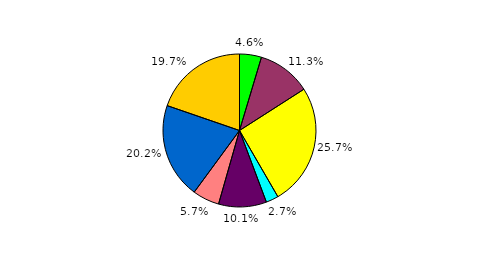
| Category | Series 0 |
|---|---|
| 0 | 4.635 |
| 1 | 11.301 |
| 2 | 25.704 |
| 3 | 2.643 |
| 4 | 10.132 |
| 5 | 5.669 |
| 6 | 20.188 |
| 7 | 19.728 |